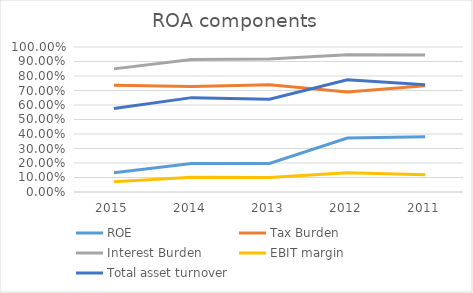
| Category | ROE | Tax Burden | Interest Burden | EBIT margin | Total asset turnover |
|---|---|---|---|---|---|
| 2015.0 | 0.133 | 0.736 | 0.849 | 0.072 | 0.576 |
| 2014.0 | 0.196 | 0.727 | 0.913 | 0.101 | 0.651 |
| 2013.0 | 0.197 | 0.739 | 0.917 | 0.1 | 0.64 |
| 2012.0 | 0.372 | 0.69 | 0.946 | 0.132 | 0.774 |
| 2011.0 | 0.381 | 0.733 | 0.944 | 0.118 | 0.74 |